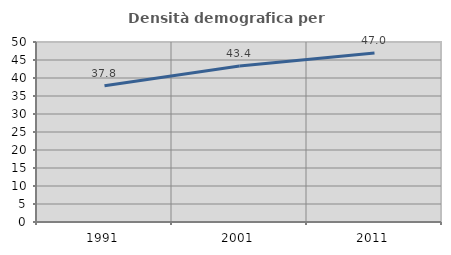
| Category | Densità demografica |
|---|---|
| 1991.0 | 37.821 |
| 2001.0 | 43.36 |
| 2011.0 | 46.969 |